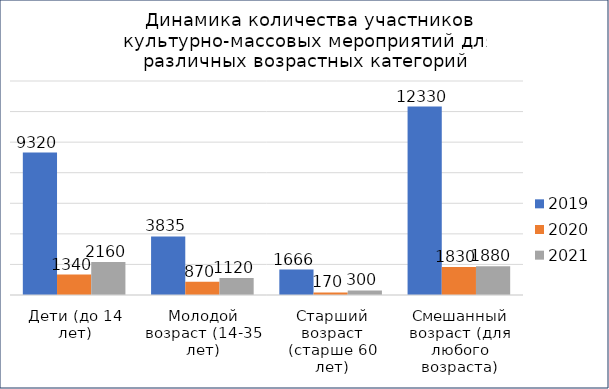
| Category | 2019 | 2020 | 2021 |
|---|---|---|---|
| Дети (до 14 лет) | 9320 | 1340 | 2160 |
| Молодой возраст (14-35 лет) | 3835 | 870 | 1120 |
| Старший возраст (старше 60 лет) | 1666 | 170 | 300 |
| Смешанный возраст (для любого возраста) | 12330 | 1830 | 1880 |